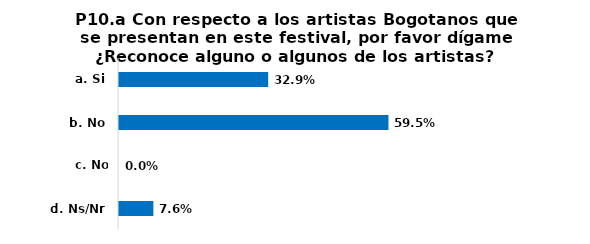
| Category | Series 0 |
|---|---|
| a. Si | 0.329 |
| b. No | 0.595 |
| c. No aplica | 0 |
| d. Ns/Nr | 0.076 |